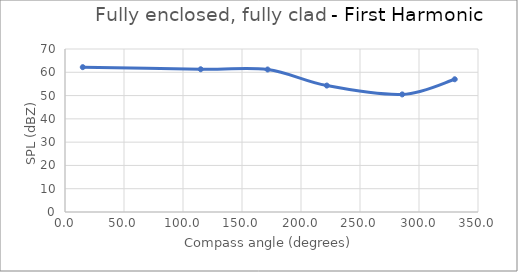
| Category | Series 0 |
|---|---|
| 15.06445125542554 | 62.2 |
| 115.00449447818254 | 61.3 |
| 171.7068171198818 | 61.2 |
| 221.8691292075067 | 54.3 |
| 285.7828166838848 | 50.5 |
| 330.28010595813004 | 57 |